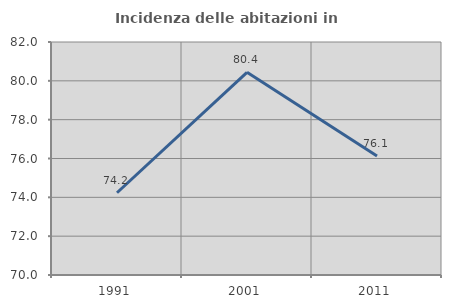
| Category | Incidenza delle abitazioni in proprietà  |
|---|---|
| 1991.0 | 74.237 |
| 2001.0 | 80.441 |
| 2011.0 | 76.134 |